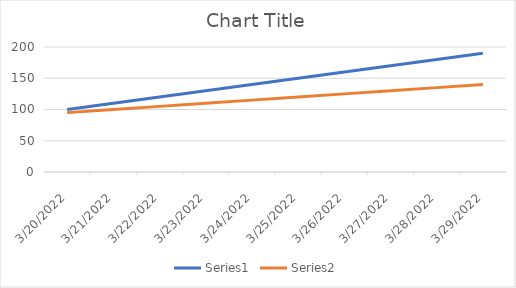
| Category | Series 0 | Series 1 |
|---|---|---|
| 3/20/22 | 100 | 95 |
| 3/21/22 | 110 | 100 |
| 3/22/22 | 120 | 105 |
| 3/23/22 | 130 | 110 |
| 3/24/22 | 140 | 115 |
| 3/25/22 | 150 | 120 |
| 3/26/22 | 160 | 125 |
| 3/27/22 | 170 | 130 |
| 3/28/22 | 180 | 135 |
| 3/29/22 | 190 | 140 |